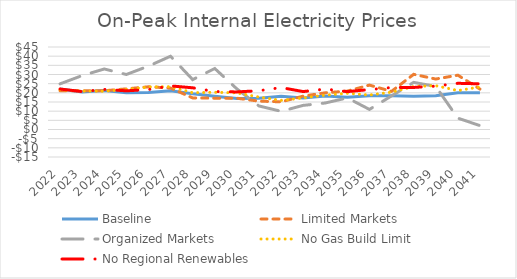
| Category | Baseline | Limited Markets | Organized Markets | No Gas Build Limit | No Regional Renewables |
|---|---|---|---|---|---|
| 2022.0 | 22.084 | 21.125 | 24.899 | 21.648 | 22.084 |
| 2023.0 | 20.404 | 21.06 | 29.416 | 20.974 | 20.682 |
| 2024.0 | 21.323 | 21.137 | 33.007 | 20.897 | 21.88 |
| 2025.0 | 20.045 | 22.163 | 30.01 | 21.792 | 21.099 |
| 2026.0 | 20.204 | 23.294 | 34.574 | 23.187 | 21.784 |
| 2027.0 | 21.131 | 22.619 | 39.969 | 23.392 | 23.789 |
| 2028.0 | 19.459 | 17.228 | 27.228 | 20.072 | 22.748 |
| 2029.0 | 18.117 | 17.067 | 33.274 | 20.304 | 20.691 |
| 2030.0 | 16.922 | 17.063 | 22.172 | 19.984 | 20.494 |
| 2031.0 | 16.995 | 15.466 | 12.848 | 17.691 | 21.161 |
| 2032.0 | 18.1 | 15.103 | 9.925 | 15.87 | 22.88 |
| 2033.0 | 17.234 | 18.187 | 13.157 | 17.227 | 20.692 |
| 2034.0 | 18.213 | 20.02 | 14.454 | 18.742 | 22.04 |
| 2035.0 | 17.557 | 20.94 | 17.239 | 19.767 | 20.663 |
| 2036.0 | 18.426 | 24.207 | 10.952 | 18.798 | 21.782 |
| 2037.0 | 18.443 | 20.814 | 18.328 | 20.386 | 22.9 |
| 2038.0 | 18.181 | 30.089 | 25.708 | 23.439 | 22.935 |
| 2039.0 | 18.408 | 27.521 | 23.48 | 23.91 | 23.659 |
| 2040.0 | 20.007 | 29.632 | 6.176 | 21.229 | 25.194 |
| 2041.0 | 20.081 | 22.043 | 2.135 | 23.251 | 24.936 |